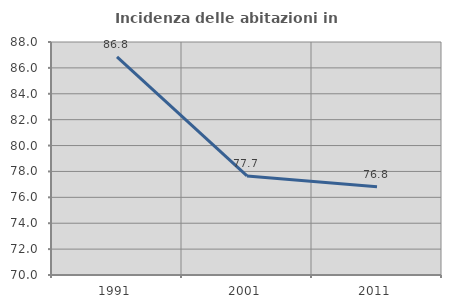
| Category | Incidenza delle abitazioni in proprietà  |
|---|---|
| 1991.0 | 86.846 |
| 2001.0 | 77.651 |
| 2011.0 | 76.821 |